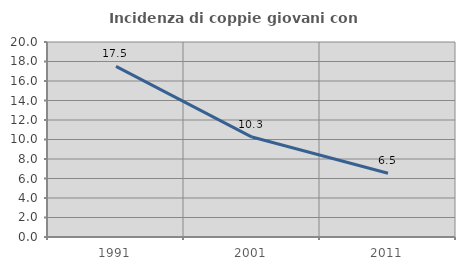
| Category | Incidenza di coppie giovani con figli |
|---|---|
| 1991.0 | 17.492 |
| 2001.0 | 10.251 |
| 2011.0 | 6.54 |